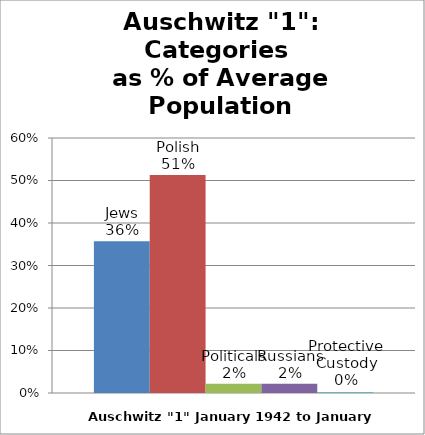
| Category | Jews | Polish | Politicals | Russians | Protective Custody |
|---|---|---|---|---|---|
| Auschwitz "1" | 0.357 | 0.513 | 0.022 | 0.022 | 0.002 |